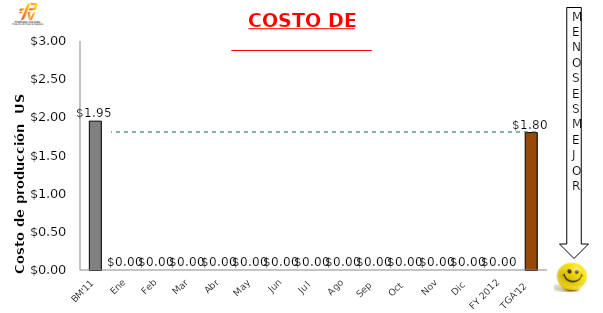
| Category | Mensual |
|---|---|
| BM'11 | 1.95 |
| Ene | 0 |
| Feb | 0 |
| Mar | 0 |
| Abr | 0 |
| May | 0 |
| Jun | 0 |
| Jul | 0 |
| Ago | 0 |
| Sep | 0 |
| Oct | 0 |
| Nov | 0 |
| Dic | 0 |
| FY 2012 | 0 |
| TGA'12 | 1.8 |